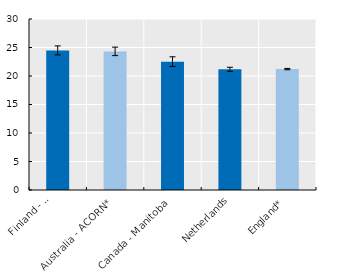
| Category | Series 0 |
|---|---|
| Finland - 
Coxa | 24.493 |
| Australia - ACORN* | 24.32 |
| Canada - Manitoba | 22.518 |
| Netherlands | 21.175 |
| England* | 21.215 |